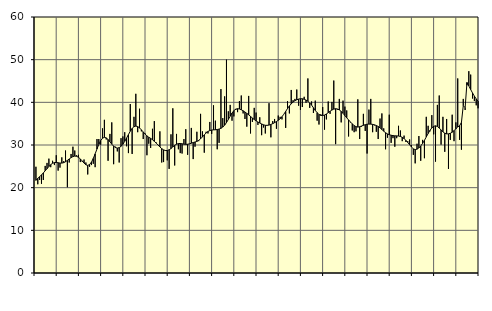
| Category | Piggar | Series 1 |
|---|---|---|
| nan | 24.9 | 21.7 |
| 1.0 | 20.8 | 22.18 |
| 1.0 | 21.8 | 22.58 |
| 1.0 | 20.9 | 22.98 |
| 1.0 | 21.8 | 23.45 |
| 1.0 | 25.1 | 23.96 |
| 1.0 | 25.8 | 24.43 |
| 1.0 | 26.8 | 24.95 |
| 1.0 | 24.8 | 25.4 |
| 1.0 | 26.3 | 25.72 |
| 1.0 | 25.3 | 25.88 |
| 1.0 | 27.6 | 25.91 |
| nan | 24 | 25.84 |
| 2.0 | 24.7 | 25.77 |
| 2.0 | 27.1 | 25.76 |
| 2.0 | 26.2 | 25.86 |
| 2.0 | 28.7 | 26.08 |
| 2.0 | 20.1 | 26.39 |
| 2.0 | 25.9 | 26.73 |
| 2.0 | 27.9 | 27.04 |
| 2.0 | 29.6 | 27.28 |
| 2.0 | 28.7 | 27.4 |
| 2.0 | 27.6 | 27.35 |
| 2.0 | 27.7 | 27.12 |
| nan | 26 | 26.74 |
| 3.0 | 26.1 | 26.27 |
| 3.0 | 26.6 | 25.77 |
| 3.0 | 25.9 | 25.37 |
| 3.0 | 23.1 | 25.22 |
| 3.0 | 24.9 | 25.42 |
| 3.0 | 25.3 | 25.98 |
| 3.0 | 25.6 | 26.85 |
| 3.0 | 24.8 | 27.92 |
| 3.0 | 31.4 | 29.06 |
| 3.0 | 31.4 | 30.14 |
| 3.0 | 30.1 | 31.02 |
| nan | 33.9 | 31.59 |
| 4.0 | 35.9 | 31.8 |
| 4.0 | 31.3 | 31.67 |
| 4.0 | 26.3 | 31.3 |
| 4.0 | 32.6 | 30.76 |
| 4.0 | 35.3 | 30.2 |
| 4.0 | 25.5 | 29.73 |
| 4.0 | 29.6 | 29.4 |
| 4.0 | 28.5 | 29.28 |
| 4.0 | 25.9 | 29.38 |
| 4.0 | 31.6 | 29.68 |
| 4.0 | 32 | 30.19 |
| nan | 33 | 30.86 |
| 5.0 | 29.7 | 31.63 |
| 5.0 | 28.1 | 32.44 |
| 5.0 | 39.6 | 33.24 |
| 5.0 | 27.9 | 33.89 |
| 5.0 | 36.6 | 34.29 |
| 5.0 | 42 | 34.43 |
| 5.0 | 33 | 34.32 |
| 5.0 | 38.5 | 34 |
| 5.0 | 33.2 | 33.55 |
| 5.0 | 31.4 | 33.06 |
| 5.0 | 32.7 | 32.57 |
| nan | 27.6 | 32.14 |
| 6.0 | 30.3 | 31.81 |
| 6.0 | 29.3 | 31.55 |
| 6.0 | 33.8 | 31.24 |
| 6.0 | 35.6 | 30.86 |
| 6.0 | 30.6 | 30.45 |
| 6.0 | 30 | 30 |
| 6.0 | 33.2 | 29.54 |
| 6.0 | 25.9 | 29.15 |
| 6.0 | 26 | 28.86 |
| 6.0 | 28.8 | 28.7 |
| 6.0 | 26.4 | 28.71 |
| nan | 24.4 | 28.88 |
| 7.0 | 32.5 | 29.17 |
| 7.0 | 38.6 | 29.55 |
| 7.0 | 25.2 | 29.92 |
| 7.0 | 32.6 | 30.19 |
| 7.0 | 29 | 30.33 |
| 7.0 | 28.1 | 30.36 |
| 7.0 | 28 | 30.28 |
| 7.0 | 31.4 | 30.19 |
| 7.0 | 33.7 | 30.15 |
| 7.0 | 27.7 | 30.18 |
| 7.0 | 30.3 | 30.27 |
| nan | 34 | 30.42 |
| 8.0 | 26.7 | 30.58 |
| 8.0 | 29.6 | 30.7 |
| 8.0 | 33.1 | 30.84 |
| 8.0 | 30.9 | 31.09 |
| 8.0 | 37.3 | 31.45 |
| 8.0 | 33.2 | 31.89 |
| 8.0 | 28.2 | 32.37 |
| 8.0 | 33.1 | 32.82 |
| 8.0 | 32.7 | 33.17 |
| 8.0 | 35.4 | 33.39 |
| 8.0 | 32.6 | 33.51 |
| nan | 39.3 | 33.55 |
| 9.0 | 35.7 | 33.57 |
| 9.0 | 29 | 33.63 |
| 9.0 | 30.5 | 33.73 |
| 9.0 | 43.1 | 33.91 |
| 9.0 | 36.3 | 34.2 |
| 9.0 | 41.4 | 34.64 |
| 9.0 | 50 | 35.25 |
| 9.0 | 37.9 | 35.98 |
| 9.0 | 39.4 | 36.76 |
| 9.0 | 35.7 | 37.49 |
| 9.0 | 36.7 | 38.06 |
| nan | 38.2 | 38.41 |
| 10.0 | 37.7 | 38.51 |
| 10.0 | 40.3 | 38.44 |
| 10.0 | 41.6 | 38.26 |
| 10.0 | 37.4 | 38.02 |
| 10.0 | 36.1 | 37.73 |
| 10.0 | 34.3 | 37.41 |
| 10.0 | 41.5 | 37.07 |
| 10.0 | 32.7 | 36.7 |
| 10.0 | 35.4 | 36.33 |
| 10.0 | 38.7 | 35.97 |
| 10.0 | 37.6 | 35.66 |
| nan | 34.7 | 35.39 |
| 11.0 | 36.5 | 35.15 |
| 11.0 | 32.3 | 34.94 |
| 11.0 | 34.1 | 34.74 |
| 11.0 | 32.7 | 34.62 |
| 11.0 | 34.7 | 34.6 |
| 11.0 | 39.8 | 34.67 |
| 11.0 | 31.8 | 34.82 |
| 11.0 | 35.6 | 35 |
| 11.0 | 36.1 | 35.24 |
| 11.0 | 33.8 | 35.5 |
| 11.0 | 36.9 | 35.79 |
| nan | 36.6 | 36.15 |
| 12.0 | 36 | 36.63 |
| 12.0 | 37.2 | 37.21 |
| 12.0 | 34 | 37.88 |
| 12.0 | 40.3 | 38.54 |
| 12.0 | 37.4 | 39.15 |
| 12.0 | 42.9 | 39.66 |
| 12.0 | 40.5 | 40.06 |
| 12.0 | 40.8 | 40.38 |
| 12.0 | 43 | 40.6 |
| 12.0 | 39.2 | 40.76 |
| 12.0 | 38.2 | 40.85 |
| nan | 38.9 | 40.83 |
| 13.0 | 41.3 | 40.72 |
| 13.0 | 39.9 | 40.53 |
| 13.0 | 45.6 | 40.25 |
| 13.0 | 38.7 | 39.86 |
| 13.0 | 40.2 | 39.35 |
| 13.0 | 37.5 | 38.73 |
| 13.0 | 40.4 | 38.11 |
| 13.0 | 35.7 | 37.57 |
| 13.0 | 34.8 | 37.16 |
| 13.0 | 37.2 | 36.93 |
| 13.0 | 38.9 | 36.9 |
| nan | 33.6 | 37.03 |
| 14.0 | 36 | 37.27 |
| 14.0 | 40.2 | 37.58 |
| 14.0 | 37.3 | 37.91 |
| 14.0 | 40.1 | 38.19 |
| 14.0 | 45.1 | 38.41 |
| 14.0 | 30.2 | 38.51 |
| 14.0 | 38.3 | 38.44 |
| 14.0 | 40.8 | 38.22 |
| 14.0 | 35.3 | 37.87 |
| 14.0 | 40.4 | 37.42 |
| 14.0 | 39 | 36.89 |
| nan | 38.1 | 36.37 |
| 15.0 | 32 | 35.88 |
| 15.0 | 35.3 | 35.4 |
| 15.0 | 33.4 | 34.94 |
| 15.0 | 33 | 34.56 |
| 15.0 | 33.2 | 34.3 |
| 15.0 | 40.7 | 34.2 |
| 15.0 | 31.4 | 34.29 |
| 15.0 | 34.3 | 34.45 |
| 15.0 | 37.3 | 34.61 |
| 15.0 | 33.3 | 34.76 |
| 15.0 | 28 | 34.87 |
| nan | 38.3 | 34.9 |
| 16.0 | 40.8 | 34.89 |
| 16.0 | 33 | 34.83 |
| 16.0 | 34.6 | 34.73 |
| 16.0 | 33.1 | 34.57 |
| 16.0 | 31.4 | 34.35 |
| 16.0 | 36.2 | 34.02 |
| 16.0 | 37.4 | 33.63 |
| 16.0 | 33.9 | 33.24 |
| 16.0 | 29 | 32.88 |
| 16.0 | 31.7 | 32.6 |
| 16.0 | 37.1 | 32.41 |
| nan | 30.5 | 32.29 |
| 17.0 | 31.6 | 32.2 |
| 17.0 | 29.6 | 32.15 |
| 17.0 | 31.6 | 32.14 |
| 17.0 | 34.5 | 32.1 |
| 17.0 | 33.4 | 32 |
| 17.0 | 30.9 | 31.8 |
| 17.0 | 32.2 | 31.5 |
| 17.0 | 30.7 | 31.09 |
| 17.0 | 30.9 | 30.59 |
| 17.0 | 31.3 | 30.06 |
| 17.0 | 30 | 29.53 |
| nan | 27.7 | 29.1 |
| 18.0 | 25.7 | 28.93 |
| 18.0 | 30.3 | 29.02 |
| 18.0 | 32.1 | 29.31 |
| 18.0 | 26.3 | 29.77 |
| 18.0 | 31.2 | 30.37 |
| 18.0 | 26.9 | 31.09 |
| 18.0 | 36.6 | 31.88 |
| 18.0 | 34.5 | 32.69 |
| 18.0 | 33.2 | 33.43 |
| 18.0 | 37 | 34.01 |
| 18.0 | 32.5 | 34.38 |
| nan | 26.1 | 34.5 |
| 19.0 | 39.4 | 34.34 |
| 19.0 | 41.6 | 33.97 |
| 19.0 | 30.1 | 33.52 |
| 19.0 | 36.6 | 33.09 |
| 19.0 | 28.4 | 32.77 |
| 19.0 | 36.1 | 32.61 |
| 19.0 | 24.4 | 32.61 |
| 19.0 | 31.2 | 32.74 |
| 19.0 | 37.1 | 33 |
| 19.0 | 30.9 | 33.37 |
| 19.0 | 35.3 | 33.8 |
| nan | 45.6 | 34.22 |
| 20.0 | 31.2 | 34.51 |
| 20.0 | 28.9 | 35.29 |
| 20.0 | 40.8 | 39.24 |
| 20.0 | 38.2 | 38.74 |
| 20.0 | 44 | 44.65 |
| 20.0 | 47.3 | 43.85 |
| 20.0 | 46.5 | 43 |
| 20.0 | 40.9 | 42.2 |
| 20.0 | 40.3 | 41.45 |
| 20.0 | 39.3 | 40.8 |
| 20.0 | 38.6 | 40.28 |